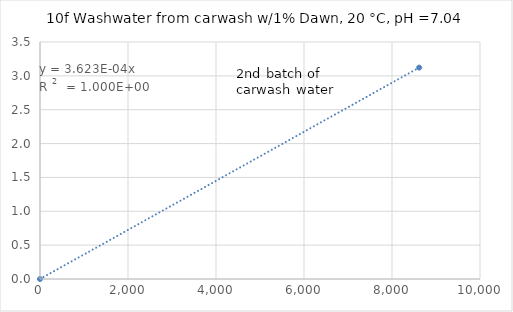
| Category | Series 0 |
|---|---|
| 0.0 | 0 |
| 8617.021276595746 | 3.122 |